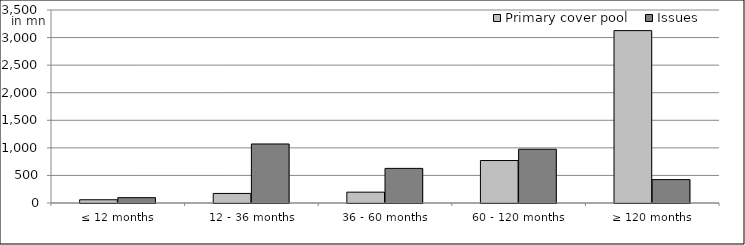
| Category | Primary cover pool | Issues |
|---|---|---|
| ≤ 12 months | 58780076.35 | 96840789.23 |
| 12 - 36 months | 173378385.923 | 1070500000 |
| 36 - 60 months | 196622710.46 | 627650000 |
| 60 - 120 months | 769877753.12 | 975000000 |
| ≥ 120 months | 3126216749.128 | 424038400.38 |